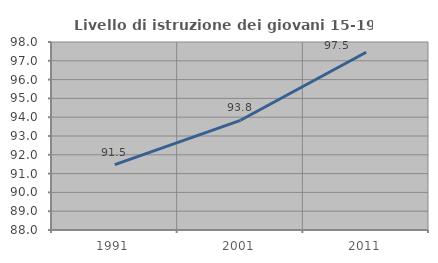
| Category | Livello di istruzione dei giovani 15-19 anni |
|---|---|
| 1991.0 | 91.48 |
| 2001.0 | 93.836 |
| 2011.0 | 97.458 |